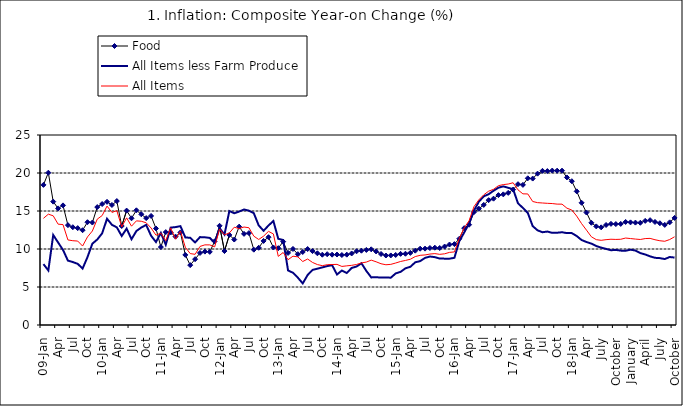
| Category | Food | All Items less Farm Produce | All Items |
|---|---|---|---|
| 09-Jan | 18.436 | 8.013 | 14.034 |
| Feb | 20.041 | 7.178 | 14.584 |
| Mar | 16.233 | 11.842 | 14.366 |
| Apr | 15.342 | 10.85 | 13.268 |
| May | 15.74 | 9.88 | 13.212 |
| June | 13.138 | 8.472 | 11.194 |
| Jul | 12.867 | 8.285 | 11.09 |
| Aug | 12.746 | 8.044 | 11.046 |
| Sep | 12.472 | 7.431 | 10.39 |
| Oct | 13.524 | 8.933 | 11.588 |
| Nov | 13.482 | 10.702 | 12.368 |
| Dec | 15.518 | 11.249 | 13.93 |
| 10-Jan | 15.918 | 12.063 | 14.398 |
| Feb | 16.208 | 13.978 | 15.649 |
| Mar | 15.79 | 13.184 | 14.812 |
| Apr | 16.306 | 12.844 | 15.044 |
| May | 13.023 | 11.711 | 12.915 |
| Jun | 15.053 | 12.686 | 14.099 |
| Jul | 14.043 | 11.287 | 13.002 |
| Aug | 15.09 | 12.366 | 13.702 |
| Sep | 14.57 | 12.83 | 13.65 |
| Oct | 14.065 | 13.168 | 13.45 |
| Nov | 14.351 | 11.746 | 12.766 |
| Dec | 12.701 | 10.917 | 11.815 |
| 11-Jan | 10.255 | 12.118 | 12.08 |
| Feb | 12.221 | 10.569 | 11.1 |
| Mar | 12.169 | 12.815 | 12.779 |
| Apr | 11.629 | 12.882 | 11.291 |
| May | 12.179 | 13.006 | 12.352 |
| Jun | 9.22 | 11.524 | 10.23 |
| Jul | 7.877 | 11.472 | 9.397 |
| Aug | 8.665 | 10.863 | 9.301 |
| Sep | 9.479 | 11.567 | 10.339 |
| Oct | 9.656 | 11.539 | 10.544 |
| Nov | 9.623 | 11.459 | 10.54 |
| Dec | 11.02 | 10.822 | 10.283 |
| 12-Jan | 13.053 | 12.748 | 12.626 |
| 12-Feb | 9.729 | 11.901 | 11.866 |
| 12-Mar | 11.848 | 14.995 | 12.111 |
| Apr | 11.246 | 14.703 | 12.866 |
| May | 12.942 | 14.926 | 12.688 |
| Jun | 11.991 | 15.199 | 12.892 |
| Jul | 12.093 | 15.045 | 12.797 |
| Aug | 9.91 | 14.714 | 11.689 |
| Sep | 10.164 | 13.101 | 11.253 |
| Oct | 11.064 | 12.398 | 11.693 |
| Nov | 11.553 | 13.092 | 12.32 |
| Dec | 10.199 | 13.685 | 11.981 |
| 13-Jan | 10.106 | 11.342 | 9.031 |
| Feb | 10.973 | 11.184 | 9.542 |
| Mar | 9.482 | 7.179 | 8.593 |
| Apr | 10.006 | 6.874 | 9.052 |
| May | 9.321 | 6.227 | 8.964 |
| Jun | 9.606 | 5.472 | 8.353 |
| Jul | 9.994 | 6.58 | 8.682 |
| Aug | 9.723 | 7.245 | 8.231 |
| Sep | 9.437 | 7.41 | 7.952 |
| Oct | 9.249 | 7.579 | 7.807 |
| Nov | 9.313 | 7.75 | 7.931 |
| Dec | 9.253 | 7.872 | 7.957 |
| 14-Jan | 9.271 | 6.648 | 7.977 |
| Feb | 9.207 | 7.166 | 7.707 |
| Mar | 9.254 | 6.836 | 7.783 |
| Apr | 9.414 | 7.508 | 7.851 |
| May | 9.698 | 7.693 | 7.965 |
| Jun | 9.776 | 8.122 | 8.167 |
| Jul | 9.878 | 7.116 | 8.281 |
| Aug | 9.959 | 6.264 | 8.534 |
| Sep | 9.676 | 6.278 | 8.317 |
| Oct | 9.343 | 6.252 | 8.06 |
| Nov | 9.144 | 6.255 | 7.927 |
| Dec | 9.152 | 6.225 | 7.978 |
| 15-Jan | 9.215 | 6.787 | 8.157 |
| Feb | 9.359 | 6.994 | 8.359 |
| Mar | 9.376 | 7.46 | 8.494 |
| Apr | 9.49 | 7.661 | 8.655 |
| May | 9.782 | 8.253 | 9.003 |
| Jun | 10.041 | 8.403 | 9.168 |
| Jul | 10.049 | 8.83 | 9.218 |
| Aug | 10.131 | 9.01 | 9.336 |
| Sep | 10.174 | 8.928 | 9.394 |
| Oct | 10.129 | 8.742 | 9.296 |
| Nov | 10.321 | 8.732 | 9.368 |
| Dec | 10.588 | 8.727 | 9.554 |
| 16-Jan | 10.642 | 8.841 | 9.617 |
| Feb | 11.348 | 11.041 | 11.379 |
| Mar | 12.745 | 12.17 | 12.775 |
| Apr | 13.194 | 13.352 | 13.721 |
| May | 14.861 | 15.054 | 15.577 |
| Jun | 15.302 | 16.224 | 16.48 |
| Jul | 15.799 | 16.929 | 17.127 |
| Aug | 16.427 | 17.208 | 17.609 |
| Sep | 16.622 | 17.666 | 17.852 |
| Oct | 17.09 | 18.067 | 18.33 |
| Nov | 17.191 | 18.241 | 18.476 |
| Dec | 17.388 | 18.052 | 18.547 |
| 17-Jan | 17.818 | 17.867 | 18.719 |
| Feb | 18.528 | 16.011 | 17.78 |
| Mar | 18.436 | 15.404 | 17.256 |
| Apr | 19.303 | 14.75 | 17.244 |
| May | 19.266 | 13.016 | 16.251 |
| Jun | 19.915 | 12.455 | 16.098 |
| Jul | 20.284 | 12.207 | 16.053 |
| Aug | 20.251 | 12.296 | 16.012 |
| Sep | 20.321 | 12.123 | 15.979 |
| Oct | 20.306 | 12.142 | 15.905 |
| Nov | 20.308 | 12.206 | 15.901 |
| Dec | 19.415 | 12.089 | 15.372 |
| 18-Jan | 18.919 | 12.09 | 15.127 |
| Feb | 17.588 | 11.707 | 14.33 |
| Mar | 16.08 | 11.181 | 13.337 |
| Apr | 14.799 | 10.92 | 12.482 |
| May | 13.448 | 10.71 | 11.608 |
| June | 12.977 | 10.387 | 11.231 |
| July | 12.85 | 10.183 | 11.142 |
| August | 13.158 | 10.015 | 11.227 |
| September | 13.309 | 9.838 | 11.284 |
| October | 13.277 | 9.882 | 11.259 |
| November | 13.301 | 9.787 | 11.281 |
| December | 13.559 | 9.771 | 11.442 |
| January | 13.505 | 9.91 | 11.374 |
| February | 13.473 | 9.8 | 11.306 |
| March | 13.451 | 9.461 | 11.251 |
| April | 13.701 | 9.28 | 11.372 |
| May | 13.794 | 9.033 | 11.396 |
| June | 13.558 | 8.841 | 11.217 |
| July | 13.392 | 8.798 | 11.084 |
| August | 13.17 | 8.678 | 11.016 |
| September | 13.507 | 8.945 | 11.244 |
| October | 14.088 | 8.876 | 11.607 |